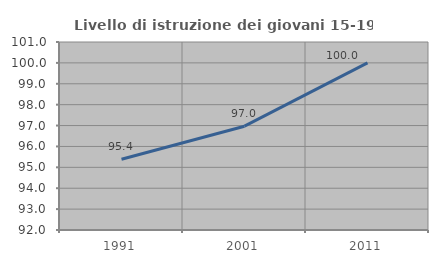
| Category | Livello di istruzione dei giovani 15-19 anni |
|---|---|
| 1991.0 | 95.385 |
| 2001.0 | 96.97 |
| 2011.0 | 100 |